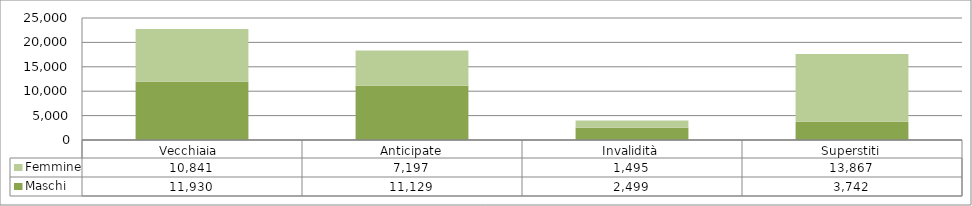
| Category | Maschi | Femmine |
|---|---|---|
| Vecchiaia  | 11930 | 10841 |
| Anticipate | 11129 | 7197 |
| Invalidità | 2499 | 1495 |
| Superstiti | 3742 | 13867 |